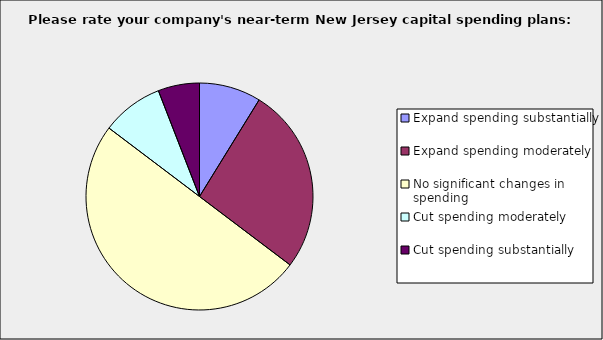
| Category | Series 0 |
|---|---|
| Expand spending substantially | 0.088 |
| Expand spending moderately | 0.265 |
| No significant changes in spending | 0.5 |
| Cut spending moderately | 0.088 |
| Cut spending substantially | 0.059 |